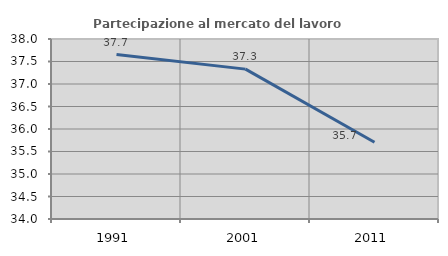
| Category | Partecipazione al mercato del lavoro  femminile |
|---|---|
| 1991.0 | 37.654 |
| 2001.0 | 37.331 |
| 2011.0 | 35.707 |